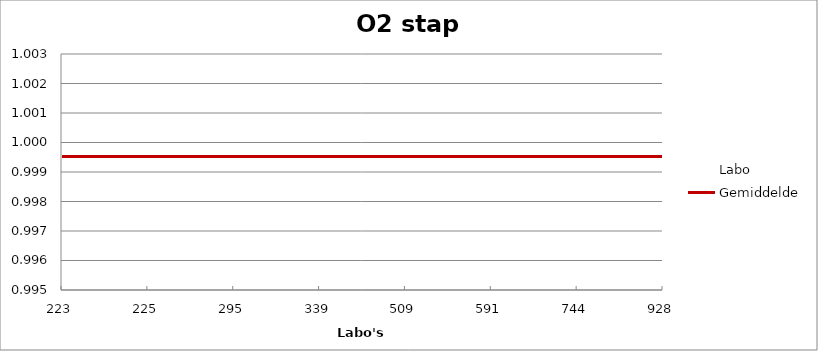
| Category | Labo | Gemiddelde |
|---|---|---|
| 223.0 | 1 | 1 |
| 225.0 | 1.001 | 1 |
| 295.0 | 1 | 1 |
| 339.0 | 1.001 | 1 |
| 509.0 | 0.997 | 1 |
| 591.0 | 1.001 | 1 |
| 744.0 | 0.998 | 1 |
| 928.0 | 0.999 | 1 |